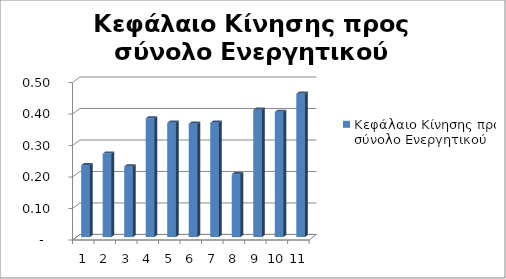
| Category | Κεφάλαιο Κίνησης προς σύνολο Ενεργητικού |
|---|---|
| 0 | 0.228 |
| 1 | 0.265 |
| 2 | 0.225 |
| 3 | 0.377 |
| 4 | 0.363 |
| 5 | 0.36 |
| 6 | 0.363 |
| 7 | 0.2 |
| 8 | 0.404 |
| 9 | 0.398 |
| 10 | 0.455 |